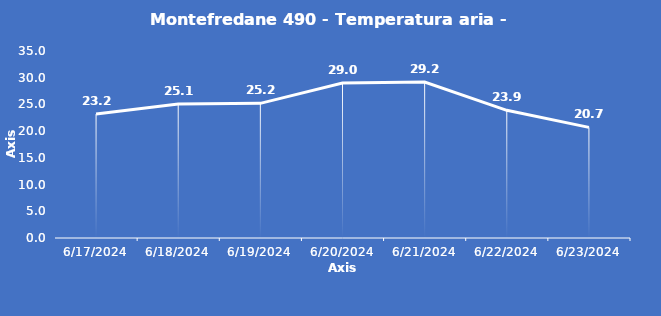
| Category | Montefredane 490 - Temperatura aria - Grezzo (°C) |
|---|---|
| 6/17/24 | 23.2 |
| 6/18/24 | 25.1 |
| 6/19/24 | 25.2 |
| 6/20/24 | 29 |
| 6/21/24 | 29.2 |
| 6/22/24 | 23.9 |
| 6/23/24 | 20.7 |